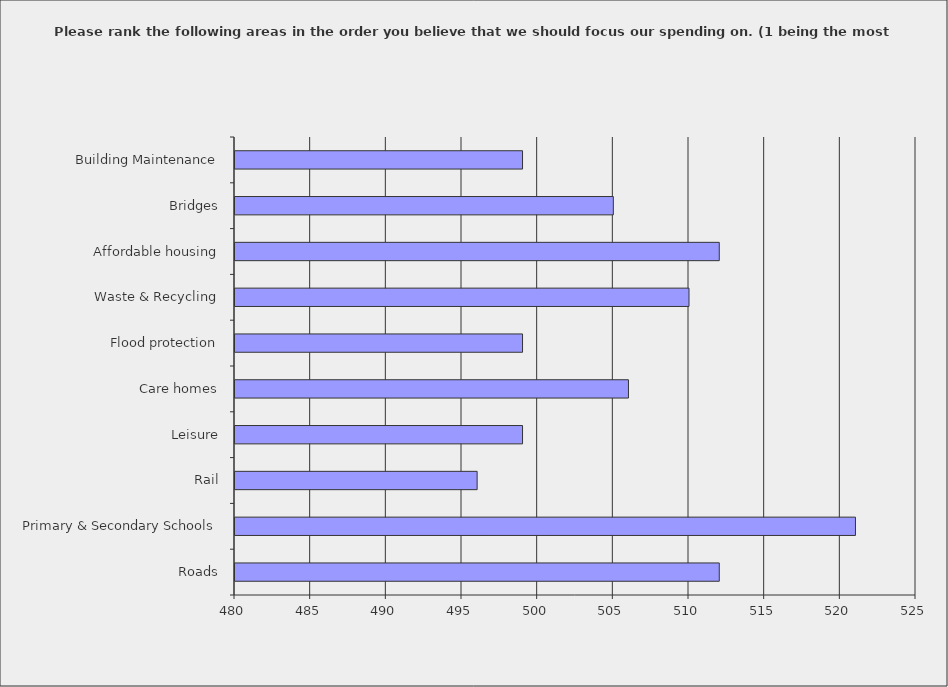
| Category | Series 0 |
|---|---|
| Roads | 512 |
| Primary & Secondary Schools | 521 |
| Rail | 496 |
| Leisure | 499 |
| Care homes | 506 |
| Flood protection | 499 |
| Waste & Recycling | 510 |
| Affordable housing | 512 |
| Bridges | 505 |
| Building Maintenance | 499 |